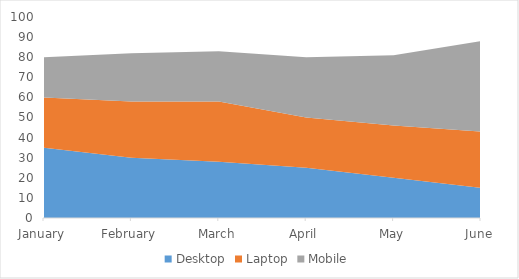
| Category | Desktop | Laptop | Mobile |
|---|---|---|---|
| January | 35 | 25 | 20 |
| February | 30 | 28 | 24 |
| March | 28 | 30 | 25 |
| April | 25 | 25 | 30 |
| May | 20 | 26 | 35 |
| June | 15 | 28 | 45 |